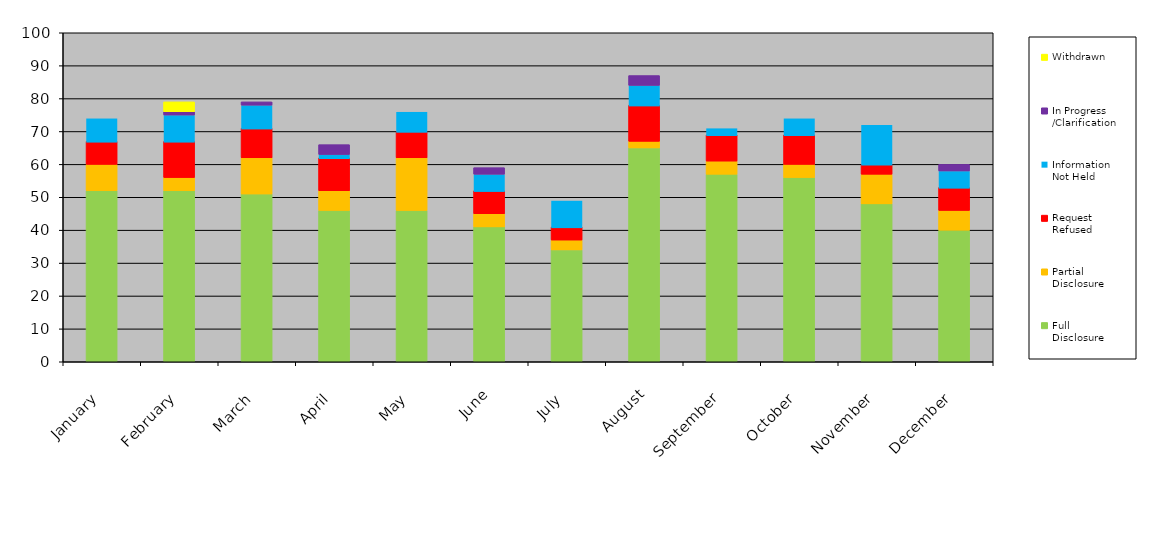
| Category | Full
Disclosure | Partial
Disclosure | Request
Refused | Information
Not Held | In Progress
/Clarification | Withdrawn |
|---|---|---|---|---|---|---|
| January | 52 | 8 | 7 | 7 | 0 | 0 |
| February | 52 | 4 | 11 | 8 | 1 | 3 |
| March | 51 | 11 | 9 | 7 | 1 | 0 |
| April | 46 | 6 | 10 | 1 | 3 | 0 |
| May | 46 | 16 | 8 | 6 | 0 | 0 |
| June | 41 | 4 | 7 | 5 | 2 | 0 |
| July | 34 | 3 | 4 | 8 | 0 | 0 |
| August | 65 | 2 | 11 | 6 | 3 | 0 |
| September | 57 | 4 | 8 | 2 | 0 | 0 |
| October | 56 | 4 | 9 | 5 | 0 | 0 |
| November | 48 | 9 | 3 | 12 | 0 | 0 |
| December | 40 | 6 | 7 | 5 | 2 | 0 |